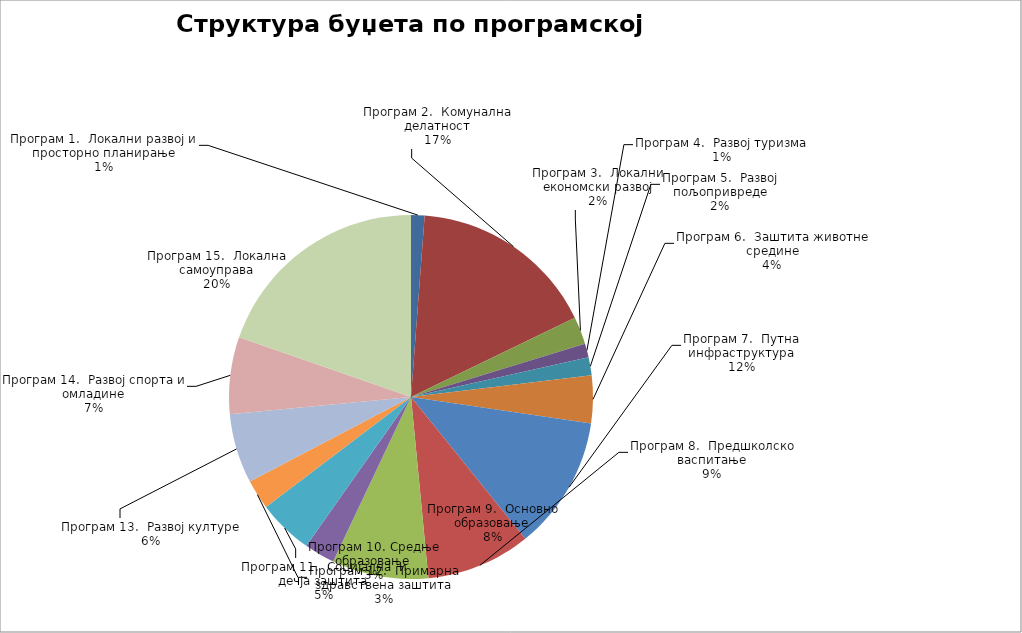
| Category | Series 0 |
|---|---|
| Програм 1.  Локални развој и просторно планирање | 10300000 |
| Програм 2.  Комунална делатност | 143000000 |
| Програм 3.  Локални економски развој | 20990000 |
| Програм 4.  Развој туризма | 10500000 |
| Програм 5.  Развој пољопривреде | 13800000 |
| Програм 6.  Заштита животне средине | 36350000 |
| Програм 7.  Путна инфраструктура | 102150000 |
| Програм 8.  Предшколско васпитање | 79780000 |
| Програм 9.  Основно образовање | 73600000 |
| Програм 10. Средње образовање | 23400000 |
| Програм 11.  Социјална  и дечја заштита | 42320000 |
| Програм 12.  Примарна здравствена заштита | 22600000 |
| Програм 13.  Развој културе | 53180000 |
| Програм 14.  Развој спорта и омладине | 58710000 |
| Програм 15.  Локална самоуправа | 169290000 |